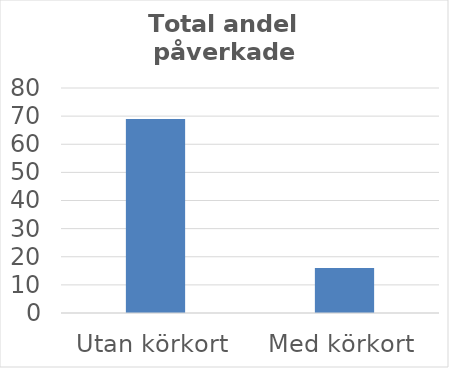
| Category | Andel % |
|---|---|
| Utan körkort | 69 |
| Med körkort | 16 |